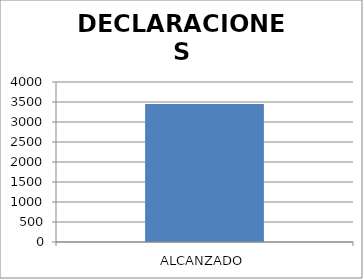
| Category | DECLARACIONES PATRIMONIALES |
|---|---|
| ALCANZADO | 3449 |